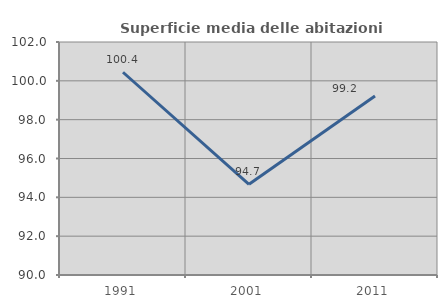
| Category | Superficie media delle abitazioni occupate |
|---|---|
| 1991.0 | 100.442 |
| 2001.0 | 94.67 |
| 2011.0 | 99.218 |